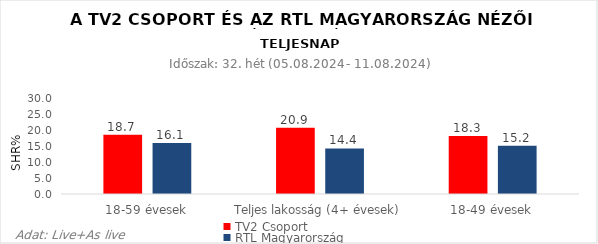
| Category | TV2 Csoport | RTL Magyarország |
|---|---|---|
| 18-59 évesek | 18.7 | 16.1 |
| Teljes lakosság (4+ évesek) | 20.9 | 14.4 |
| 18-49 évesek | 18.3 | 15.2 |